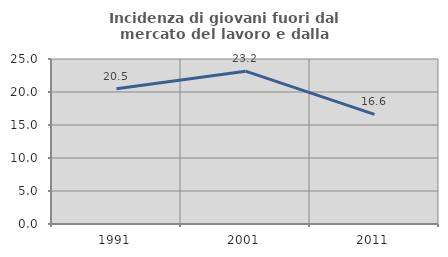
| Category | Incidenza di giovani fuori dal mercato del lavoro e dalla formazione  |
|---|---|
| 1991.0 | 20.498 |
| 2001.0 | 23.154 |
| 2011.0 | 16.62 |